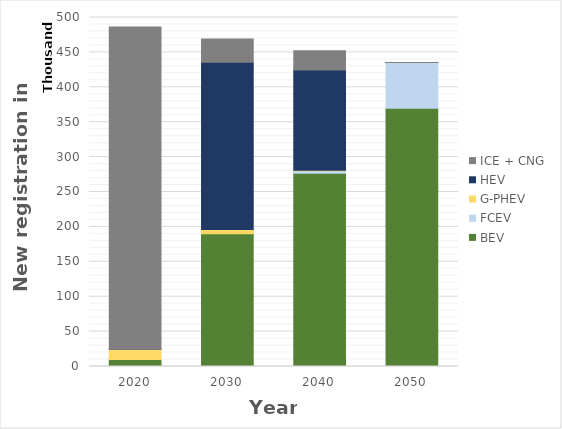
| Category | BEV | FCEV | G-PHEV | HEV | ICE + CNG |
|---|---|---|---|---|---|
| 2020.0 | 9904 | 0 | 14782 | 6 | 461653 |
| 2030.0 | 190198 | 0 | 6048 | 239540 | 33323 |
| 2040.0 | 276684 | 3872 | 672 | 143485 | 27485 |
| 2050.0 | 369956 | 65478 | 0 | 100 | 52 |